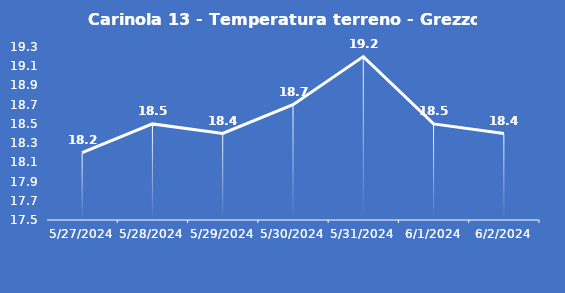
| Category | Carinola 13 - Temperatura terreno - Grezzo (°C) |
|---|---|
| 5/27/24 | 18.2 |
| 5/28/24 | 18.5 |
| 5/29/24 | 18.4 |
| 5/30/24 | 18.7 |
| 5/31/24 | 19.2 |
| 6/1/24 | 18.5 |
| 6/2/24 | 18.4 |